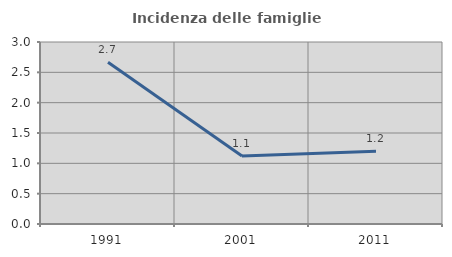
| Category | Incidenza delle famiglie numerose |
|---|---|
| 1991.0 | 2.667 |
| 2001.0 | 1.12 |
| 2011.0 | 1.199 |